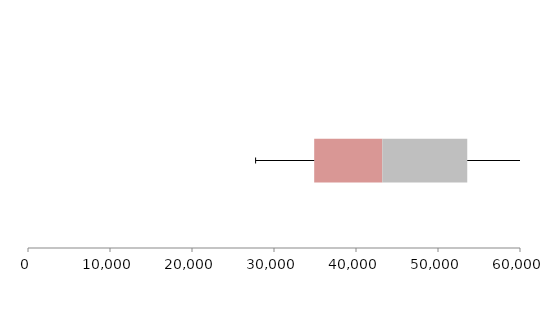
| Category | Series 1 | Series 2 | Series 3 |
|---|---|---|---|
| 0 | 34901.881 | 8306.428 | 10358.662 |